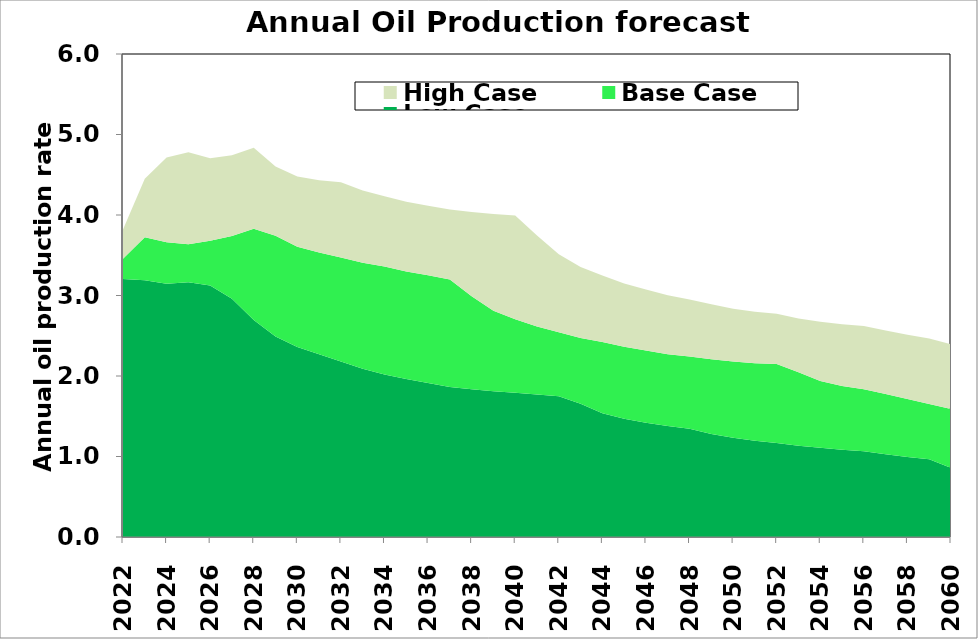
| Category | Low Case | Base Case | High Case |
|---|---|---|---|
| 2022.0 | 3205230.094 | 251170.987 | 364037.635 |
| 2023.0 | 3189248.726 | 532934.703 | 727139.66 |
| 2024.0 | 3145368 | 515997.785 | 1052248.498 |
| 2025.0 | 3163966.713 | 473839.242 | 1142931.746 |
| 2026.0 | 3123383.993 | 555904.807 | 1024387.946 |
| 2027.0 | 2958104.992 | 780892.162 | 1004370.649 |
| 2028.0 | 2696313.323 | 1134142.734 | 1004799.459 |
| 2029.0 | 2489826.766 | 1251188.722 | 862811.191 |
| 2030.0 | 2361419.852 | 1242845.969 | 875392.315 |
| 2031.0 | 2268845.088 | 1263782.617 | 899965.765 |
| 2032.0 | 2181084.984 | 1289417.494 | 936908.188 |
| 2033.0 | 2088890.81 | 1317734.545 | 897788.813 |
| 2034.0 | 2020167.282 | 1340939.411 | 873096.087 |
| 2035.0 | 1962161.481 | 1334992.427 | 867957.631 |
| 2036.0 | 1911946.867 | 1339829.1 | 864000.656 |
| 2037.0 | 1862598.227 | 1334896.214 | 871087.844 |
| 2038.0 | 1834268.295 | 1155843.535 | 1047162.171 |
| 2039.0 | 1811220.594 | 998294.895 | 1201938.907 |
| 2040.0 | 1792446.133 | 913402.177 | 1289409.284 |
| 2041.0 | 1768668.804 | 847584.84 | 1130168.839 |
| 2042.0 | 1747196.526 | 796799.786 | 967909.221 |
| 2043.0 | 1655116.643 | 818424.468 | 880162.953 |
| 2044.0 | 1538653.854 | 882269.693 | 828283.929 |
| 2045.0 | 1468477.349 | 893928.958 | 787676.702 |
| 2046.0 | 1420230.275 | 896605.029 | 758632.669 |
| 2047.0 | 1378947.651 | 891762.944 | 733924.204 |
| 2048.0 | 1344905.039 | 896748.401 | 709983.583 |
| 2049.0 | 1280100.551 | 927394.614 | 683480.631 |
| 2050.0 | 1232387.077 | 948794.234 | 655753.225 |
| 2051.0 | 1194847.407 | 962248.407 | 640381.859 |
| 2052.0 | 1167446.784 | 980727.128 | 625609.709 |
| 2053.0 | 1134091.206 | 911778.63 | 669458.735 |
| 2054.0 | 1107708.147 | 829099.269 | 736007.644 |
| 2055.0 | 1083664.926 | 791662.294 | 766253.102 |
| 2056.0 | 1063936.997 | 769995.471 | 788182.144 |
| 2057.0 | 1029332.525 | 746906.89 | 789616.285 |
| 2058.0 | 995288.533 | 719625.123 | 798217.2 |
| 2059.0 | 966259.131 | 686626.048 | 814352.858 |
| 2060.0 | 858698.017 | 730233.72 | 806483.632 |